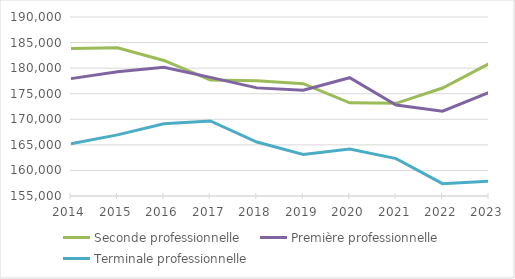
| Category | Seconde professionnelle | Première professionnelle | Terminale professionnelle |
|---|---|---|---|
| 2014.0 | 183857 | 177950 | 165212 |
| 2015.0 | 183968 | 179276 | 166946 |
| 2016.0 | 181503 | 180185 | 169142 |
| 2017.0 | 177688 | 178190 | 169666 |
| 2018.0 | 177523 | 176141 | 165552 |
| 2019.0 | 176970 | 175695 | 163113 |
| 2020.0 | 173220 | 178128 | 164185 |
| 2021.0 | 173125 | 172792 | 162315 |
| 2022.0 | 176114 | 171574 | 157410 |
| 2023.0 | 180855 | 175263 | 157901 |